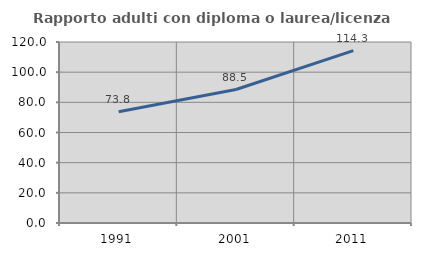
| Category | Rapporto adulti con diploma o laurea/licenza media  |
|---|---|
| 1991.0 | 73.764 |
| 2001.0 | 88.478 |
| 2011.0 | 114.286 |